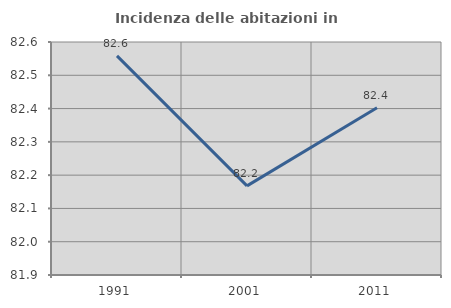
| Category | Incidenza delle abitazioni in proprietà  |
|---|---|
| 1991.0 | 82.558 |
| 2001.0 | 82.168 |
| 2011.0 | 82.402 |